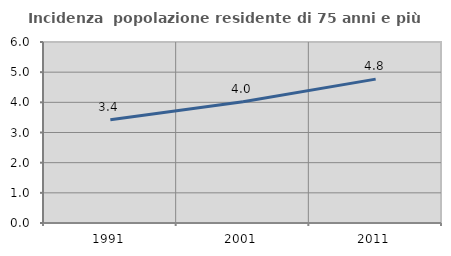
| Category | Incidenza  popolazione residente di 75 anni e più |
|---|---|
| 1991.0 | 3.421 |
| 2001.0 | 4.022 |
| 2011.0 | 4.769 |